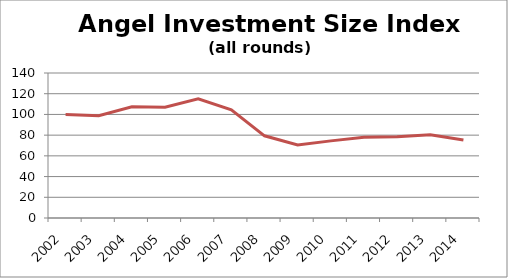
| Category | Investment Amount Index |
|---|---|
| 2002.0 | 100 |
| 2003.0 | 98.817 |
| 2004.0 | 107.484 |
| 2005.0 | 107.006 |
| 2006.0 | 115.099 |
| 2007.0 | 104.373 |
| 2008.0 | 79.354 |
| 2009.0 | 70.523 |
| 2010.0 | 74.457 |
| 2011.0 | 77.899 |
| 2012.0 | 78.337 |
| 2013.0 | 80.399 |
| 2014.0 | 75.288 |